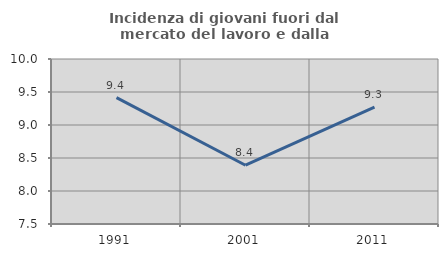
| Category | Incidenza di giovani fuori dal mercato del lavoro e dalla formazione  |
|---|---|
| 1991.0 | 9.415 |
| 2001.0 | 8.391 |
| 2011.0 | 9.272 |